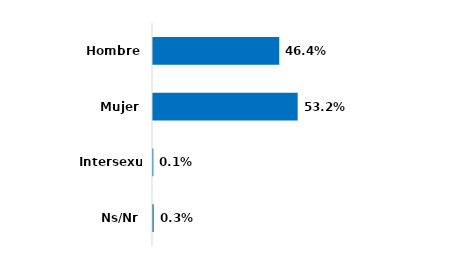
| Category | Series 0 |
|---|---|
| Hombre | 0.464 |
| Mujer | 0.532 |
| Intersexual | 0.001 |
| Ns/Nr | 0.003 |